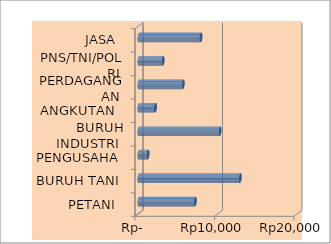
| Category | Series 0 |
|---|---|
| PETANI | 7081 |
| BURUH TANI | 12732 |
| PENGUSAHA | 1136 |
| BURUH INDUSTRI | 10192 |
| ANGKUTAN | 2060 |
| PERDAGANGAN | 5548 |
| PNS/TNI/POLRI | 3024 |
| JASA | 7791 |